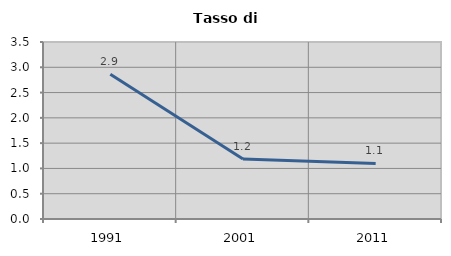
| Category | Tasso di disoccupazione   |
|---|---|
| 1991.0 | 2.861 |
| 2001.0 | 1.185 |
| 2011.0 | 1.099 |